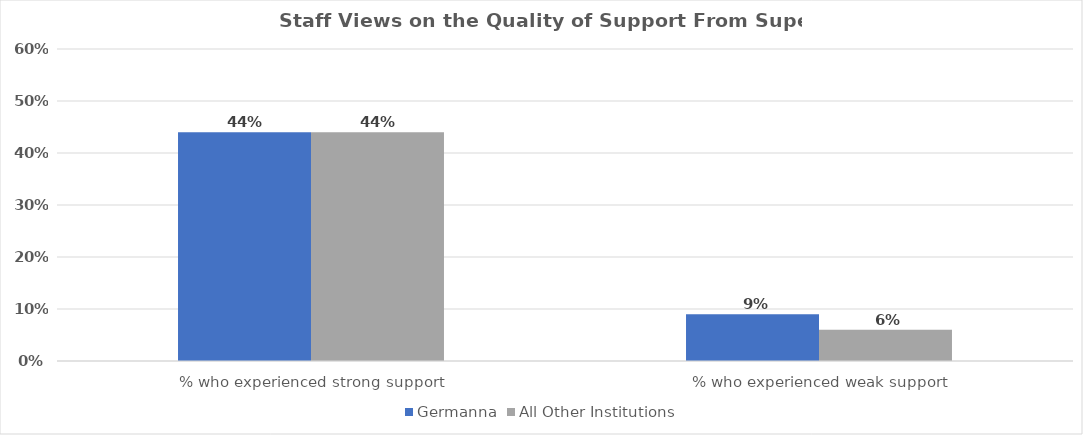
| Category | Germanna | All Other Institutions |
|---|---|---|
| % who experienced strong support | 0.44 | 0.44 |
| % who experienced weak support | 0.09 | 0.06 |